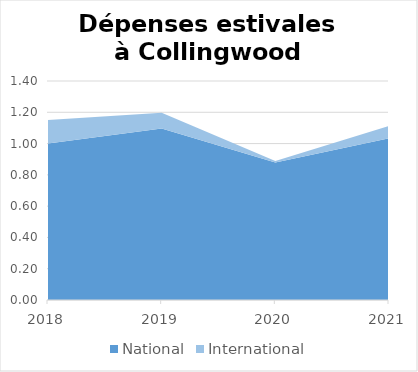
| Category | National | International |
|---|---|---|
| 2018.0 | 1 | 0.15 |
| 2019.0 | 1.097 | 0.1 |
| 2020.0 | 0.879 | 0.01 |
| 2021.0 | 1.033 | 0.08 |